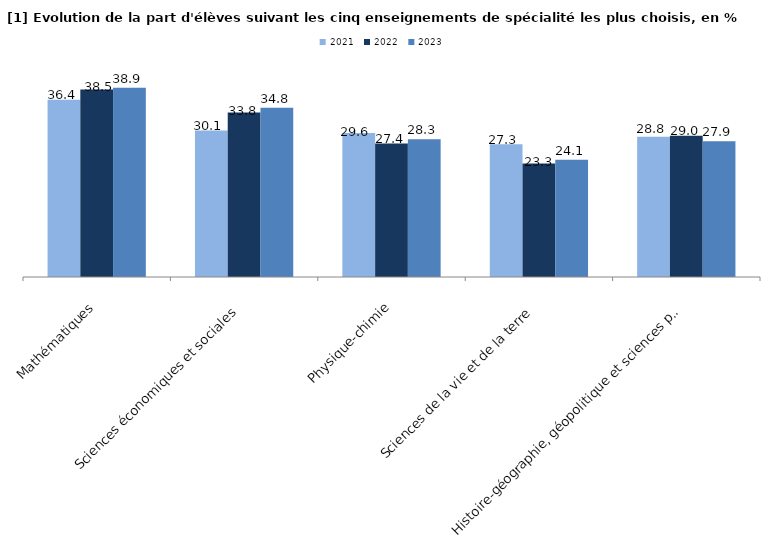
| Category | 2021 | 2022 | 2023 |
|---|---|---|---|
| Mathématiques | 36.4 | 38.523 | 38.9 |
| Sciences économiques et sociales | 30.1 | 33.785 | 34.8 |
| Physique-chimie | 29.6 | 27.446 | 28.3 |
| Sciences de la vie et de la terre | 27.3 | 23.3 | 24.1 |
| Histoire-géographie, géopolitique et sciences politiques | 28.8 | 29 | 27.9 |